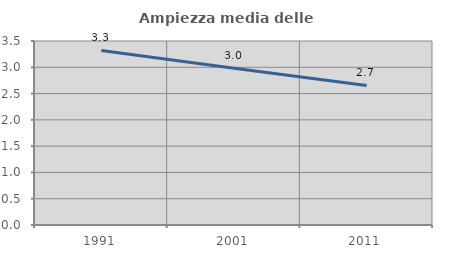
| Category | Ampiezza media delle famiglie |
|---|---|
| 1991.0 | 3.32 |
| 2001.0 | 2.983 |
| 2011.0 | 2.654 |